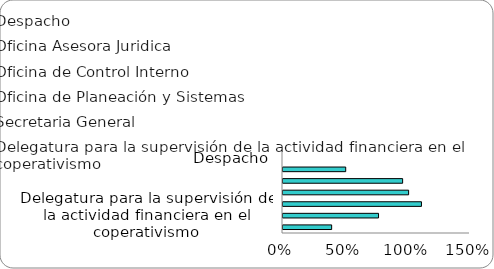
| Category | Series 0 |
|---|---|
| Despacho | 0 |
| Oficina Asesora Juridica | 0.503 |
| Oficina de Control Interno | 0.96 |
| Oficina de Planeación y Sistemas | 1.008 |
| Secretaria General | 1.111 |
| Delegatura para la supervisión de la actividad financiera en el coperativismo | 0.766 |
| Delegatura para la supervisión del ahorro y la forma asociativa soldaria. | 0.39 |